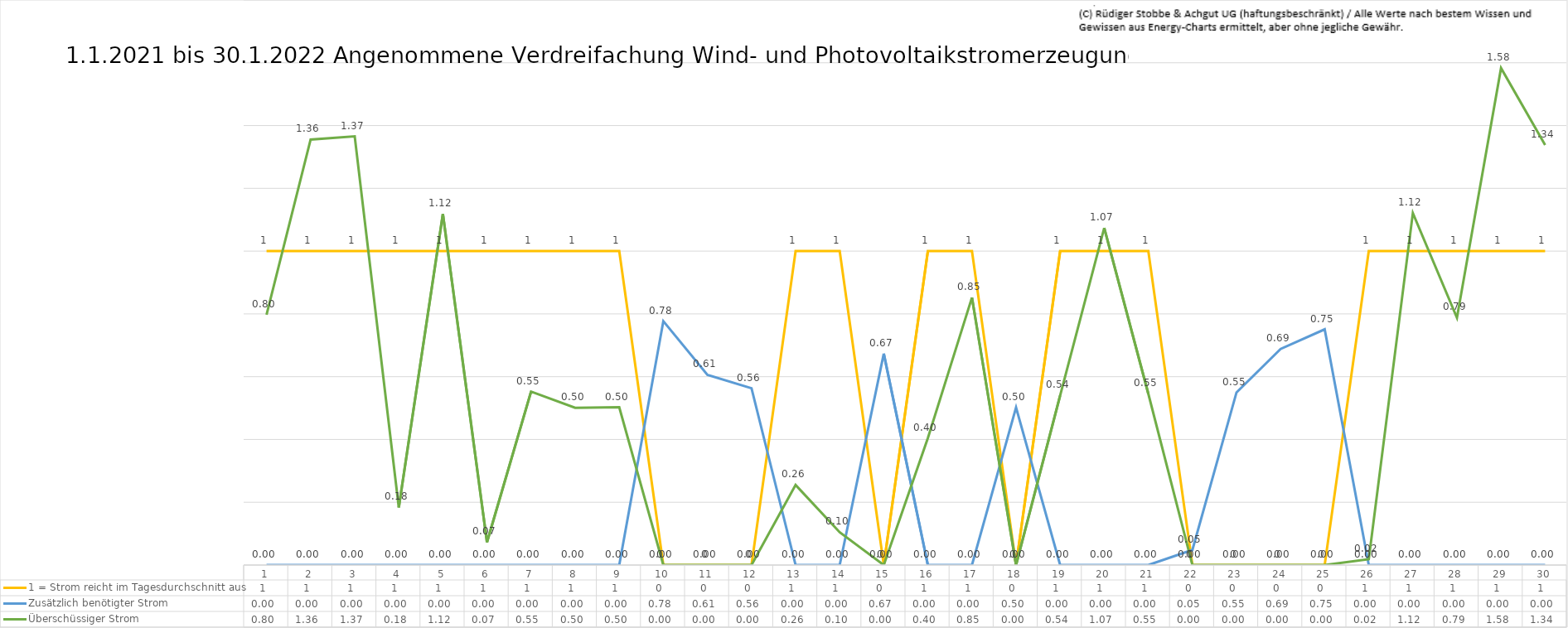
| Category | 1 = Strom reicht im Tagesdurchschnitt aus | Zusätzlich benötigter Strom | Überschüssiger Strom |
|---|---|---|---|
| 0 | 1 | 0 | 0.798 |
| 1 | 1 | 0 | 1.356 |
| 2 | 1 | 0 | 1.366 |
| 3 | 1 | 0 | 0.184 |
| 4 | 1 | 0 | 1.118 |
| 5 | 1 | 0 | 0.073 |
| 6 | 1 | 0 | 0.553 |
| 7 | 1 | 0 | 0.501 |
| 8 | 1 | 0 | 0.503 |
| 9 | 0 | 0.777 | 0 |
| 10 | 0 | 0.606 | 0 |
| 11 | 0 | 0.563 | 0 |
| 12 | 1 | 0 | 0.255 |
| 13 | 1 | 0 | 0.104 |
| 14 | 0 | 0.673 | 0 |
| 15 | 1 | 0 | 0.405 |
| 16 | 1 | 0 | 0.852 |
| 17 | 0 | 0.502 | 0 |
| 18 | 1 | 0 | 0.54 |
| 19 | 1 | 0 | 1.074 |
| 20 | 1 | 0 | 0.546 |
| 21 | 0 | 0.048 | 0 |
| 22 | 0 | 0.55 | 0 |
| 23 | 0 | 0.688 | 0 |
| 24 | 0 | 0.751 | 0 |
| 25 | 1 | 0 | 0.018 |
| 26 | 1 | 0 | 1.121 |
| 27 | 1 | 0 | 0.788 |
| 28 | 1 | 0 | 1.583 |
| 29 | 1 | 0 | 1.338 |